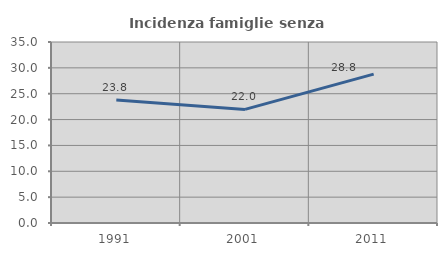
| Category | Incidenza famiglie senza nuclei |
|---|---|
| 1991.0 | 23.78 |
| 2001.0 | 21.966 |
| 2011.0 | 28.798 |